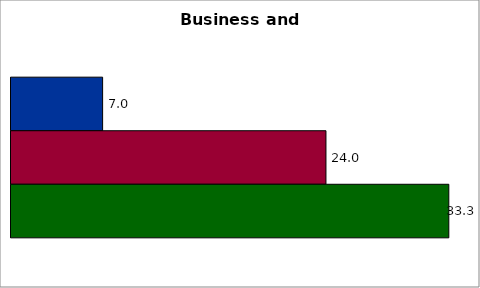
| Category | 50 states and D.C. | SREB states | State |
|---|---|---|---|
| 0 | 6.971 | 23.965 | 33.312 |